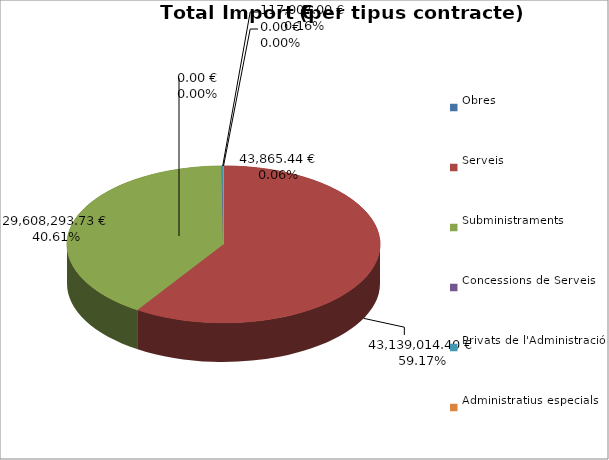
| Category | Total preu
(amb IVA) |
|---|---|
| Obres | 43865.44 |
| Serveis | 43139014.4 |
| Subministraments | 29608293.73 |
| Concessions de Serveis | 0 |
| Privats de l'Administració | 117007 |
| Administratius especials | 0 |